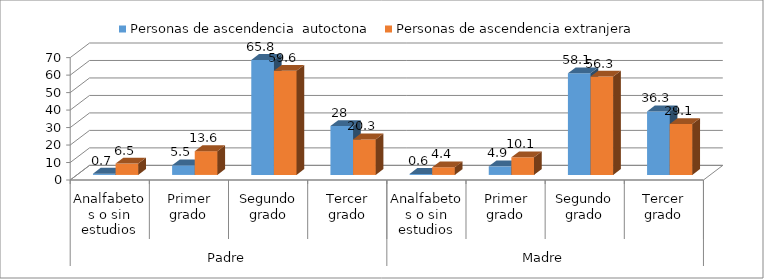
| Category | Personas de ascendencia  autoctona | Personas de ascendencia extranjera |
|---|---|---|
| 0 | 0.7 | 6.5 |
| 1 | 5.5 | 13.6 |
| 2 | 65.8 | 59.6 |
| 3 | 28 | 20.3 |
| 4 | 0.6 | 4.4 |
| 5 | 4.9 | 10.1 |
| 6 | 58.1 | 56.3 |
| 7 | 36.3 | 29.1 |